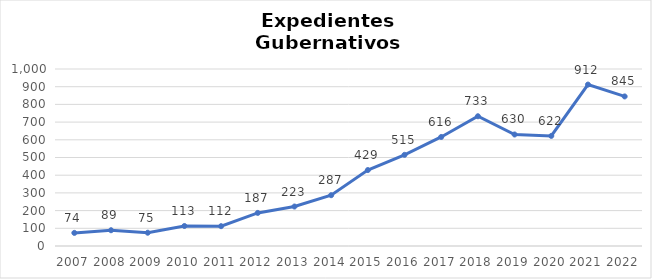
| Category | Expedientes Gubernativos |
|---|---|
| 2007.0 | 74 |
| 2008.0 | 89 |
| 2009.0 | 75 |
| 2010.0 | 113 |
| 2011.0 | 112 |
| 2012.0 | 187 |
| 2013.0 | 223 |
| 2014.0 | 287 |
| 2015.0 | 429 |
| 2016.0 | 515 |
| 2017.0 | 616 |
| 2018.0 | 733 |
| 2019.0 | 630 |
| 2020.0 | 622 |
| 2021.0 | 912 |
| 2022.0 | 845 |